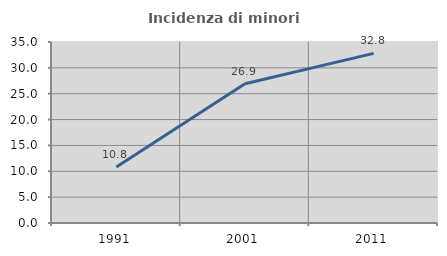
| Category | Incidenza di minori stranieri |
|---|---|
| 1991.0 | 10.811 |
| 2001.0 | 26.923 |
| 2011.0 | 32.801 |